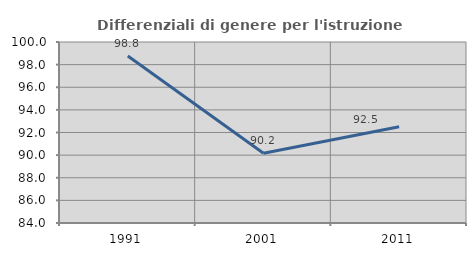
| Category | Differenziali di genere per l'istruzione superiore |
|---|---|
| 1991.0 | 98.757 |
| 2001.0 | 90.168 |
| 2011.0 | 92.507 |